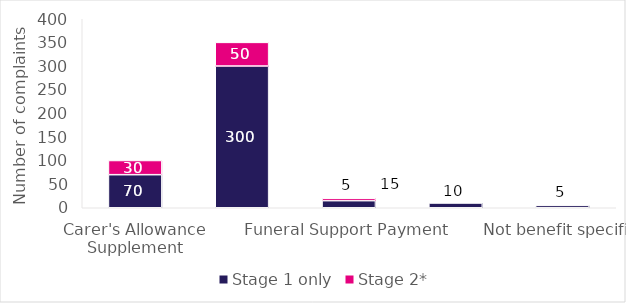
| Category | Stage 1 only | Stage 2* |
|---|---|---|
| Carer's Allowance Supplement | 70 | 30 |
| Best Start Grant and Best Start Foods | 300 | 50 |
| Funeral Support Payment | 15 | 5 |
| Scottish Child Payment | 10 | 0 |
| Not benefit specific | 5 | 0 |